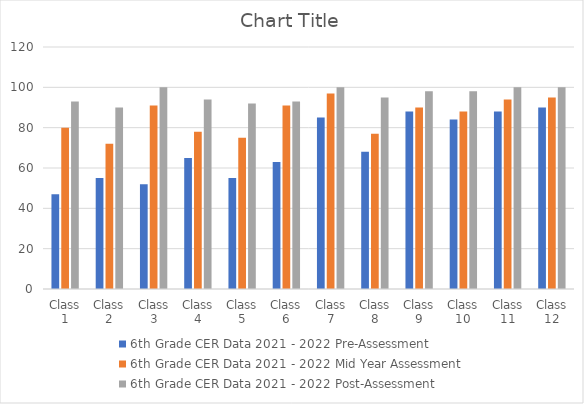
| Category | 6th Grade CER Data 2021 - 2022 |
|---|---|
| Class 1 | 93 |
| Class 2 | 90 |
| Class 3 | 100 |
| Class 4 | 94 |
| Class 5 | 92 |
| Class 6 | 93 |
| Class 7 | 100 |
| Class 8 | 95 |
| Class 9 | 98 |
| Class 10 | 98 |
| Class 11 | 100 |
| Class 12 | 100 |